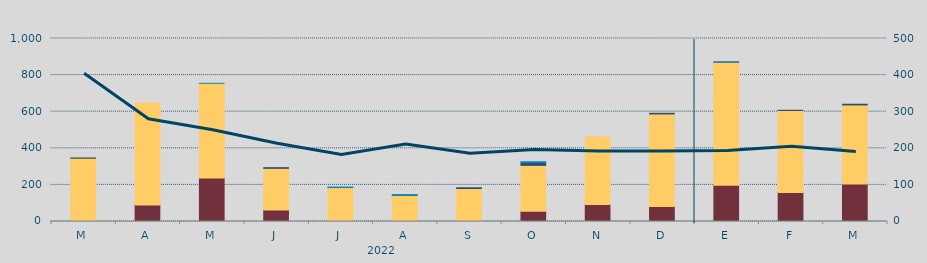
| Category | Carbón | Ciclo Combinado | Cogeneración | Consumo Bombeo | Eólica | Hidráulica | Otras Renovables | Solar fotovoltaica | Solar térmica | Turbinación bombeo | Nuclear |
|---|---|---|---|---|---|---|---|---|---|---|---|
| M | 280 | 345584.7 | 0 | 1304.2 | 0 | 0 | 0 | 0 | 0 | 0 | 0 |
| A | 89745.4 | 556069.1 | 0 | 0 | 0 | 0 | 0 | 0 | 0 | 0 | 0 |
| M | 238246.1 | 516625.8 | 0 | 0 | 0 | 170 | 0 | 0 | 0 | 0 | 0 |
| J | 63431.6 | 227120.9 | 0 | 3696.9 | 0 | 0 | 0 | 0 | 0 | 0 | 0 |
| J | 347.9 | 185242.2 | 0 | 1000 | 0 | 958 | 0 | 0 | 0 | 0 | 0 |
| A | 0 | 142890.1 | 241.5 | 1836 | 0 | 1759 | 0 | 0 | 0 | 0 | 0 |
| S | 2508 | 177724.1 | 0 | 4233 | 0 | 0 | 52.5 | 0 | 0 | 0 | 0 |
| O | 55771 | 250950.8 | 0 | 16354.2 | 0 | 3609 | 27 | 0 | 0 | 0 | 0 |
| N | 92910 | 369242.3 | 0 | 0 | 0 | 0 | 0 | 0 | 0 | 0 | 0 |
| D | 82210 | 505508.6 | 0 | 3568.7 | 0 | 0 | 0 | 0 | 0 | 0 | 0 |
| E | 198667 | 672278.9 | 0 | 600 | 0 | 167.2 | 0 | 0 | 0 | 0 | 0 |
| F | 158446.8 | 448230.6 | 0 | 876 | 0 | 0 | 0 | 0 | 0 | 0 | 0 |
| M | 205470 | 431456.4 | 0 | 3844 | 0 | 0 | 0 | 0 | 0 | 0 | 0 |